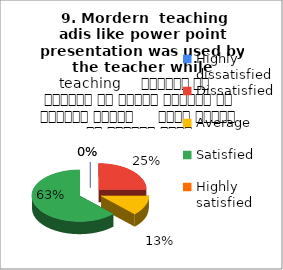
| Category |  9. Mordern  teaching adis like power point presentation was used by the teacher while teaching     शिक्षक ने शिक्षण के दौरान शिक्षण की आधुनिक तकनीक     पावर पॉइंट का प्रयोग किया |
|---|---|
| Highly dissatisfied | 0 |
| Dissatisfied | 2 |
| Average | 1 |
| Satisfied | 5 |
| Highly satisfied | 0 |